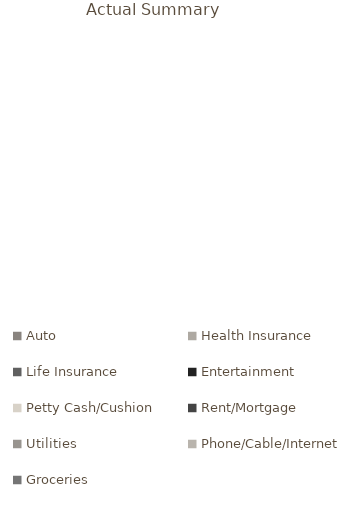
| Category | Yearly |
|---|---|
| Auto | 0 |
| Health Insurance | 0 |
| Life Insurance | 0 |
| Entertainment | 0 |
| Petty Cash/Cushion | 0 |
| Rent/Mortgage | 0 |
| Utilities | 0 |
| Phone/Cable/Internet | 0 |
| Groceries | 0 |
| House Cleaning | 0 |
| Hair/Beauty/Personal | 0 |
| Eating Out/Dining | 0 |
| Clothing/Misc/Personal | 0 |
| Gas | 0 |
| Car Insurance | 0 |
| Kids/Misc | 0 |
| Student Loans | 0 |
| Cell Phones | 0 |
| College Savings | 0 |
| Retirement Savings | 0 |